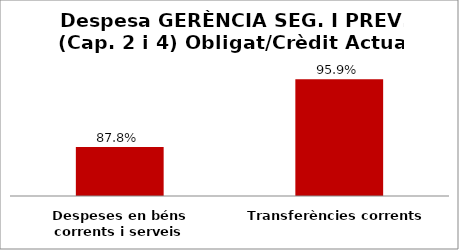
| Category | Series 0 |
|---|---|
| Despeses en béns corrents i serveis | 0.878 |
| Transferències corrents | 0.959 |